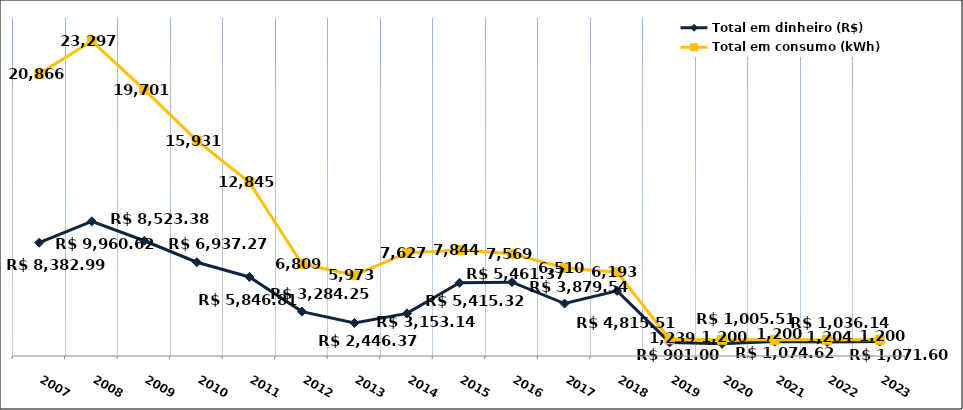
| Category | Total em dinheiro (R$) |
|---|---|
| 2007.0 | 8382.99 |
| 2008.0 | 9960.62 |
| 2009.0 | 8523.38 |
| 2010.0 | 6937.27 |
| 2011.0 | 5846.81 |
| 2012.0 | 3284.25 |
| 2013.0 | 2446.37 |
| 2014.0 | 3153.14 |
| 2015.0 | 5415.32 |
| 2016.0 | 5461.37 |
| 2017.0 | 3879.54 |
| 2018.0 | 4815.51 |
| 2019.0 | 1005.51 |
| 2020.0 | 901 |
| 2021.0 | 1074.62 |
| 2022.0 | 1036.14 |
| 2023.0 | 1071.6 |